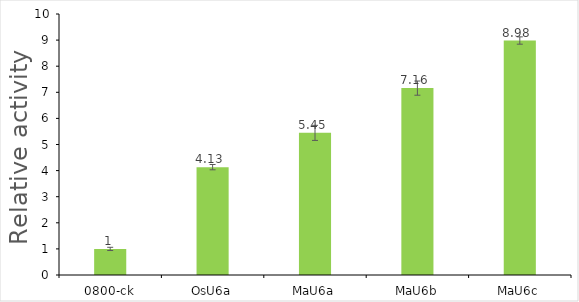
| Category | Mean value |
|---|---|
| 0800-ck | 1 |
| OsU6a | 4.132 |
| MaU6a | 5.446 |
| MaU6b | 7.16 |
| MaU6c | 8.984 |